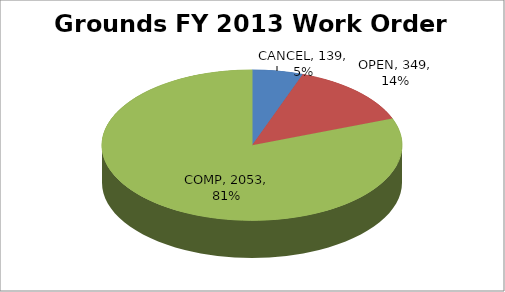
| Category | Series 0 |
|---|---|
| CANCEL | 139 |
| OPEN | 349 |
| COMP | 2053 |